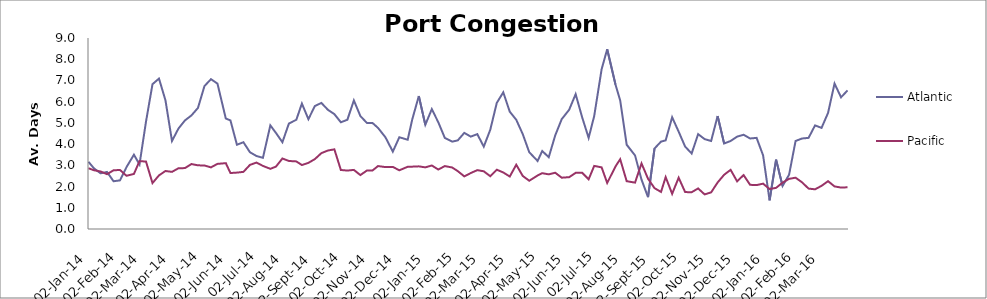
| Category | Atlantic  | Pacific |
|---|---|---|
| 2014-01-02 | 3.167 | 2.863 |
| 2014-01-08 | 2.854 | 2.767 |
| 2014-01-15 | 2.625 | 2.712 |
| 2014-01-22 | 2.688 | 2.582 |
| 2014-01-29 | 2.25 | 2.767 |
| 2014-02-05 | 2.292 | 2.781 |
| 2014-02-12 | 2.917 | 2.507 |
| 2014-02-20 | 3.5 | 2.596 |
| 2014-02-26 | 3.042 | 3.199 |
| 2014-03-05 | 5.059 | 3.178 |
| 2014-03-12 | 6.824 | 2.164 |
| 2014-03-19 | 7.088 | 2.527 |
| 2014-03-26 | 6.059 | 2.733 |
| 2014-04-02 | 4.147 | 2.692 |
| 2014-04-09 | 4.735 | 2.863 |
| 2014-04-16 | 5.118 | 2.87 |
| 2014-04-23 | 5.353 | 3.062 |
| 2014-04-30 | 5.706 | 3 |
| 2014-05-07 | 6.735 | 2.993 |
| 2014-05-14 | 7.059 | 2.904 |
| 2014-05-21 | 6.853 | 3.068 |
| 2014-05-30 | 5.206 | 3.103 |
| 2014-06-04 | 5.118 | 2.637 |
| 2014-06-11 | 3.971 | 2.658 |
| 2014-06-18 | 4.088 | 2.692 |
| 2014-06-25 | 3.618 | 3.021 |
| 2014-07-02 | 3.441 | 3.13 |
| 2014-07-09 | 3.353 | 2.973 |
| 2014-07-17 | 4.882 | 2.836 |
| 2014-07-23 | 4.529 | 2.938 |
| 2014-07-30 | 4.088 | 3.322 |
| 2014-08-06 | 4.971 | 3.205 |
| 2014-08-14 | 5.147 | 3.185 |
| 2014-08-20 | 5.912 | 3.014 |
| 2014-08-27 | 5.176 | 3.116 |
| 2014-09-03 | 5.794 | 3.295 |
| 2014-09-10 | 5.941 | 3.575 |
| 2014-09-17 | 5.618 | 3.699 |
| 2014-09-24 | 5.412 | 3.753 |
| 2014-10-01 | 5.029 | 2.781 |
| 2014-10-08 | 5.147 | 2.753 |
| 2014-10-15 | 6.059 | 2.785 |
| 2014-10-22 | 5.324 | 2.541 |
| 2014-10-29 | 5 | 2.753 |
| 2014-11-04 | 5 | 2.753 |
| 2014-11-10 | 4.765 | 2.966 |
| 2014-11-18 | 4.324 | 2.918 |
| 2014-11-26 | 3.647 | 2.925 |
| 2014-12-03 | 4.324 | 2.767 |
| 2014-12-12 | 4.206 | 2.932 |
| 2014-12-17 | 5.176 | 2.938 |
| 2014-12-24 | 6.265 | 2.952 |
| 2014-12-31 | 4.912 | 2.904 |
| 2015-01-07 | 5.647 | 2.993 |
| 2015-01-14 | 5.029 | 2.801 |
| 2015-01-21 | 4.294 | 2.966 |
| 2015-01-29 | 4.118 | 2.897 |
| 2015-02-04 | 4.176 | 2.726 |
| 2015-02-11 | 4.529 | 2.479 |
| 2015-02-18 | 4.353 | 2.637 |
| 2015-02-25 | 4.471 | 2.774 |
| 2015-03-04 | 3.882 | 2.719 |
| 2015-03-11 | 4.676 | 2.486 |
| 2015-03-18 | 5.941 | 2.795 |
| 2015-03-25 | 6.441 | 2.664 |
| 2015-04-01 | 5.529 | 2.473 |
| 2015-04-08 | 5.147 | 3.027 |
| 2015-04-15 | 4.471 | 2.5 |
| 2015-04-22 | 3.618 | 2.274 |
| 2015-05-01 | 3.206 | 2.521 |
| 2015-05-06 | 3.676 | 2.63 |
| 2015-05-13 | 3.382 | 2.575 |
| 2015-05-20 | 4.412 | 2.651 |
| 2015-05-27 | 5.176 | 2.418 |
| 2015-06-04 | 5.618 | 2.442 |
| 2015-06-11 | 6.353 | 2.645 |
| 2015-06-18 | 5.265 | 2.651 |
| 2015-06-25 | 4.294 | 2.342 |
| 2015-07-01 | 5.324 | 2.973 |
| 2015-07-09 | 7.529 | 2.904 |
| 2015-07-15 | 8.471 | 2.168 |
| 2015-07-24 | 6.794 | 2.952 |
| 2015-07-29 | 6.059 | 3.288 |
| 2015-08-05 | 3.971 | 2.253 |
| 2015-08-14 | 3.471 | 2.185 |
| 2015-08-21 | 2.324 | 3.089 |
| 2015-08-28 | 1.5 | 2.37 |
| 2015-09-04 | 3.794 | 1.925 |
| 2015-09-11 | 4.118 | 1.747 |
| 2015-09-16 | 4.176 | 2.445 |
| 2015-09-23 | 5.265 | 1.658 |
| 2015-09-30 | 4.588 | 2.418 |
| 2015-10-07 | 3.882 | 1.74 |
| 2015-10-14 | 3.559 | 1.733 |
| 2015-10-21 | 4.471 | 1.911 |
| 2015-10-28 | 4.235 | 1.63 |
| 2015-11-04 | 4.147 | 1.726 |
| 2015-11-11 | 5.324 | 2.192 |
| 2015-11-18 | 4.029 | 2.555 |
| 2015-11-25 | 4.147 | 2.788 |
| 2015-12-02 | 4.353 | 2.247 |
| 2015-12-09 | 4.441 | 2.541 |
| 2015-12-16 | 4.265 | 2.082 |
| 2015-12-23 | 4.294 | 2.068 |
| 2015-12-30 | 3.471 | 2.137 |
| 2016-01-06 | 1.353 | 1.884 |
| 2016-01-13 | 3.265 | 1.938 |
| 2016-01-20 | 2.029 | 2.185 |
| 2016-01-27 | 2.559 | 2.363 |
| 2016-02-03 | 4.147 | 2.418 |
| 2016-02-10 | 4.265 | 2.199 |
| 2016-02-17 | 4.294 | 1.904 |
| 2016-02-24 | 4.882 | 1.87 |
| 2016-03-02 | 4.765 | 2.034 |
| 2016-03-09 | 5.471 | 2.253 |
| 2016-03-16 | 6.853 | 2.007 |
| 2016-03-23 | 6.206 | 1.952 |
| 2016-03-30 | 6.529 | 1.966 |